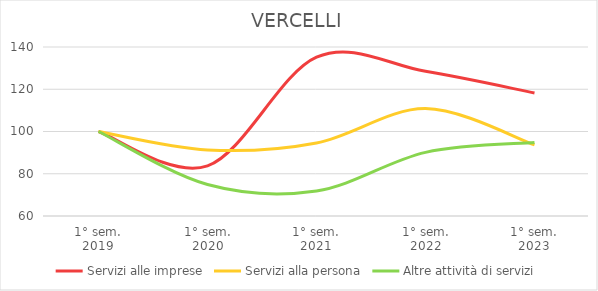
| Category | Servizi alle imprese | Servizi alla persona | Altre attività di servizi |
|---|---|---|---|
| 1° sem.
2019 | 100 | 100 | 100 |
| 1° sem.
2020 | 83.732 | 91.273 | 74.888 |
| 1° sem.
2021 | 135.178 | 94.593 | 71.861 |
| 1° sem.
2022 | 128.489 | 110.856 | 90.135 |
| 1° sem.
2023 | 118.249 | 93.699 | 94.843 |